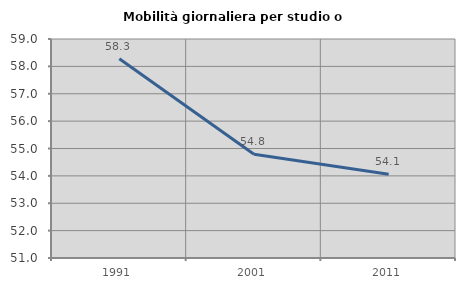
| Category | Mobilità giornaliera per studio o lavoro |
|---|---|
| 1991.0 | 58.277 |
| 2001.0 | 54.789 |
| 2011.0 | 54.06 |